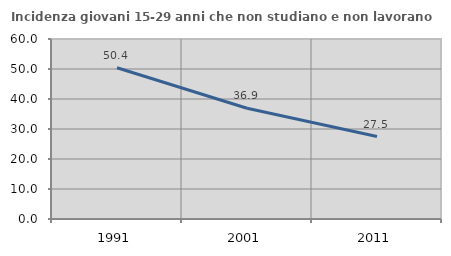
| Category | Incidenza giovani 15-29 anni che non studiano e non lavorano  |
|---|---|
| 1991.0 | 50.424 |
| 2001.0 | 36.926 |
| 2011.0 | 27.486 |